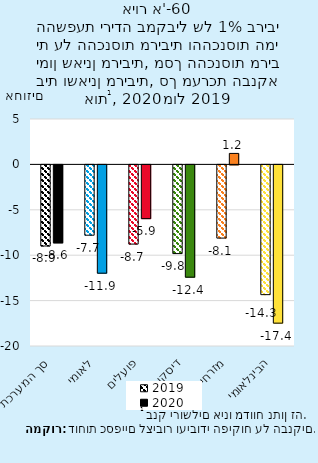
| Category | 2019 | 2020 |
|---|---|---|
| סך המערכת | -8.929 | -8.587 |
| לאומי | -7.743 | -11.926 |
| פועלים | -8.722 | -5.92 |
| דיסקונט | -9.768 | -12.366 |
| מזרחי | -8.062 | 1.21 |
| הבינלאומי | -14.289 | -17.428 |